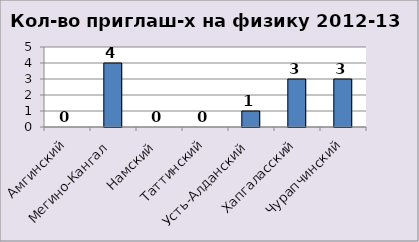
| Category | физика |
|---|---|
| Амгинский | 0 |
| Мегино-Кангал | 4 |
| Намский | 0 |
| Таттинский | 0 |
| Усть-Алданский | 1 |
| Хапгаласский | 3 |
| Чурапчинский | 3 |